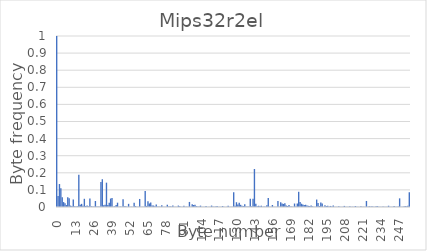
| Category | Series 0 |
|---|---|
| 0.0 | 1 |
| 1.0 | 0.065 |
| 2.0 | 0.134 |
| 3.0 | 0.109 |
| 4.0 | 0.058 |
| 5.0 | 0.029 |
| 6.0 | 0.022 |
| 7.0 | 0.011 |
| 8.0 | 0.057 |
| 9.0 | 0.051 |
| 10.0 | 0.008 |
| 11.0 | 0.006 |
| 12.0 | 0.044 |
| 13.0 | 0.004 |
| 14.0 | 0.003 |
| 15.0 | 0.004 |
| 16.0 | 0.188 |
| 17.0 | 0.013 |
| 18.0 | 0.018 |
| 19.0 | 0.007 |
| 20.0 | 0.048 |
| 21.0 | 0.006 |
| 22.0 | 0.009 |
| 23.0 | 0.004 |
| 24.0 | 0.049 |
| 25.0 | 0.004 |
| 26.0 | 0.003 |
| 27.0 | 0.003 |
| 28.0 | 0.035 |
| 29.0 | 0.002 |
| 30.0 | 0.003 |
| 31.0 | 0.002 |
| 32.0 | 0.147 |
| 33.0 | 0.162 |
| 34.0 | 0.01 |
| 35.0 | 0.014 |
| 36.0 | 0.142 |
| 37.0 | 0.011 |
| 38.0 | 0.025 |
| 39.0 | 0.049 |
| 40.0 | 0.052 |
| 41.0 | 0.002 |
| 42.0 | 0.005 |
| 43.0 | 0.012 |
| 44.0 | 0.025 |
| 45.0 | 0.002 |
| 46.0 | 0.002 |
| 47.0 | 0.002 |
| 48.0 | 0.045 |
| 49.0 | 0.004 |
| 50.0 | 0.004 |
| 51.0 | 0.002 |
| 52.0 | 0.018 |
| 53.0 | 0.002 |
| 54.0 | 0.002 |
| 55.0 | 0.002 |
| 56.0 | 0.024 |
| 57.0 | 0.005 |
| 58.0 | 0.002 |
| 59.0 | 0.002 |
| 60.0 | 0.047 |
| 61.0 | 0.001 |
| 62.0 | 0.002 |
| 63.0 | 0.002 |
| 64.0 | 0.094 |
| 65.0 | 0.006 |
| 66.0 | 0.033 |
| 67.0 | 0.021 |
| 68.0 | 0.026 |
| 69.0 | 0.008 |
| 70.0 | 0.009 |
| 71.0 | 0.005 |
| 72.0 | 0.014 |
| 73.0 | 0.003 |
| 74.0 | 0.002 |
| 75.0 | 0.002 |
| 76.0 | 0.01 |
| 77.0 | 0.001 |
| 78.0 | 0.001 |
| 79.0 | 0.001 |
| 80.0 | 0.013 |
| 81.0 | 0.003 |
| 82.0 | 0.004 |
| 83.0 | 0.002 |
| 84.0 | 0.009 |
| 85.0 | 0.002 |
| 86.0 | 0.002 |
| 87.0 | 0.002 |
| 88.0 | 0.008 |
| 89.0 | 0.004 |
| 90.0 | 0.001 |
| 91.0 | 0.001 |
| 92.0 | 0.007 |
| 93.0 | 0.001 |
| 94.0 | 0.002 |
| 95.0 | 0.001 |
| 96.0 | 0.03 |
| 97.0 | 0.001 |
| 98.0 | 0.017 |
| 99.0 | 0.012 |
| 100.0 | 0.013 |
| 101.0 | 0.005 |
| 102.0 | 0.003 |
| 103.0 | 0.002 |
| 104.0 | 0.008 |
| 105.0 | 0.002 |
| 106.0 | 0.001 |
| 107.0 | 0.001 |
| 108.0 | 0.005 |
| 109.0 | 0.001 |
| 110.0 | 0.001 |
| 111.0 | 0.001 |
| 112.0 | 0.008 |
| 113.0 | 0.002 |
| 114.0 | 0.002 |
| 115.0 | 0.002 |
| 116.0 | 0.006 |
| 117.0 | 0.001 |
| 118.0 | 0.001 |
| 119.0 | 0.001 |
| 120.0 | 0.006 |
| 121.0 | 0.002 |
| 122.0 | 0.001 |
| 123.0 | 0.001 |
| 124.0 | 0.008 |
| 125.0 | 0.001 |
| 126.0 | 0.002 |
| 127.0 | 0.002 |
| 128.0 | 0.086 |
| 129.0 | 0.007 |
| 130.0 | 0.028 |
| 131.0 | 0.014 |
| 132.0 | 0.026 |
| 133.0 | 0.013 |
| 134.0 | 0.007 |
| 135.0 | 0.005 |
| 136.0 | 0.016 |
| 137.0 | 0.003 |
| 138.0 | 0.003 |
| 139.0 | 0.002 |
| 140.0 | 0.049 |
| 141.0 | 0.004 |
| 142.0 | 0.048 |
| 143.0 | 0.222 |
| 144.0 | 0.019 |
| 145.0 | 0.004 |
| 146.0 | 0.007 |
| 147.0 | 0.004 |
| 148.0 | 0.008 |
| 149.0 | 0.002 |
| 150.0 | 0.003 |
| 151.0 | 0.002 |
| 152.0 | 0.01 |
| 153.0 | 0.052 |
| 154.0 | 0.001 |
| 155.0 | 0.001 |
| 156.0 | 0.012 |
| 157.0 | 0.001 |
| 158.0 | 0.001 |
| 159.0 | 0.001 |
| 160.0 | 0.035 |
| 161.0 | 0.002 |
| 162.0 | 0.028 |
| 163.0 | 0.02 |
| 164.0 | 0.018 |
| 165.0 | 0.021 |
| 166.0 | 0.008 |
| 167.0 | 0.006 |
| 168.0 | 0.011 |
| 169.0 | 0.003 |
| 170.0 | 0.003 |
| 171.0 | 0.002 |
| 172.0 | 0.02 |
| 173.0 | 0.002 |
| 174.0 | 0.021 |
| 175.0 | 0.089 |
| 176.0 | 0.029 |
| 177.0 | 0.019 |
| 178.0 | 0.015 |
| 179.0 | 0.012 |
| 180.0 | 0.013 |
| 181.0 | 0.009 |
| 182.0 | 0.007 |
| 183.0 | 0.006 |
| 184.0 | 0.008 |
| 185.0 | 0.004 |
| 186.0 | 0.001 |
| 187.0 | 0.001 |
| 188.0 | 0.044 |
| 189.0 | 0.024 |
| 190.0 | 0.006 |
| 191.0 | 0.026 |
| 192.0 | 0.021 |
| 193.0 | 0.001 |
| 194.0 | 0.01 |
| 195.0 | 0.006 |
| 196.0 | 0.007 |
| 197.0 | 0.003 |
| 198.0 | 0.006 |
| 199.0 | 0.003 |
| 200.0 | 0.008 |
| 201.0 | 0.001 |
| 202.0 | 0.001 |
| 203.0 | 0.001 |
| 204.0 | 0.004 |
| 205.0 | 0.001 |
| 206.0 | 0.001 |
| 207.0 | 0.001 |
| 208.0 | 0.006 |
| 209.0 | 0.001 |
| 210.0 | 0.001 |
| 211.0 | 0.001 |
| 212.0 | 0.005 |
| 213.0 | 0.001 |
| 214.0 | 0.002 |
| 215.0 | 0.002 |
| 216.0 | 0.006 |
| 217.0 | 0.001 |
| 218.0 | 0.001 |
| 219.0 | 0.001 |
| 220.0 | 0.005 |
| 221.0 | 0.001 |
| 222.0 | 0.002 |
| 223.0 | 0.001 |
| 224.0 | 0.035 |
| 225.0 | 0.001 |
| 226.0 | 0.004 |
| 227.0 | 0.002 |
| 228.0 | 0.005 |
| 229.0 | 0.002 |
| 230.0 | 0.002 |
| 231.0 | 0.004 |
| 232.0 | 0.005 |
| 233.0 | 0.001 |
| 234.0 | 0.001 |
| 235.0 | 0.001 |
| 236.0 | 0.003 |
| 237.0 | 0.001 |
| 238.0 | 0.001 |
| 239.0 | 0.001 |
| 240.0 | 0.007 |
| 241.0 | 0.001 |
| 242.0 | 0.001 |
| 243.0 | 0.002 |
| 244.0 | 0.006 |
| 245.0 | 0.001 |
| 246.0 | 0.002 |
| 247.0 | 0.003 |
| 248.0 | 0.051 |
| 249.0 | 0.002 |
| 250.0 | 0.002 |
| 251.0 | 0.002 |
| 252.0 | 0.006 |
| 253.0 | 0.003 |
| 254.0 | 0.007 |
| 255.0 | 0.086 |